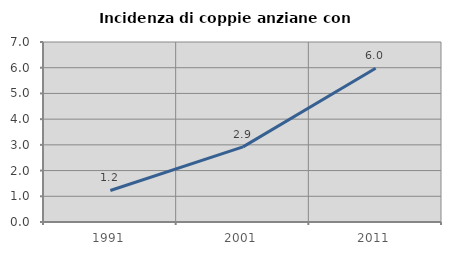
| Category | Incidenza di coppie anziane con figli |
|---|---|
| 1991.0 | 1.225 |
| 2001.0 | 2.923 |
| 2011.0 | 5.978 |